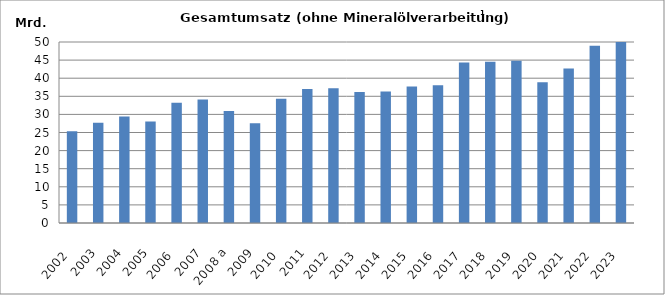
| Category | Series 1 |
|---|---|
| 2002  | 25322166.693 |
| 2003 | 27678709.853 |
| 2004 | 29399599.118 |
| 2005 | 28068624.714 |
| 2006  | 33185360.851 |
| 2007 | 34119646.051 |
| 2008 a | 30915600.271 |
| 2009 | 27521316.637 |
| 2010  | 34332768.486 |
| 2011 | 37004422.262 |
| 2012  | 37206235.695 |
| 2013  | 36200697.321 |
| 2014  | 36332803.449 |
| 2015  | 37693837.925 |
| 2016  | 38036870.621 |
| 2017  | 44327215.865 |
| 2018  | 44522389.348 |
| 2019  | 44820794.924 |
| 2020  | 38855651.718 |
| 2021  | 42649642.331 |
| 2022  | 48975703.686 |
| 2023  | 50993300.113 |